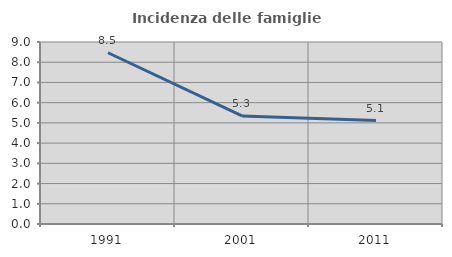
| Category | Incidenza delle famiglie numerose |
|---|---|
| 1991.0 | 8.468 |
| 2001.0 | 5.342 |
| 2011.0 | 5.115 |